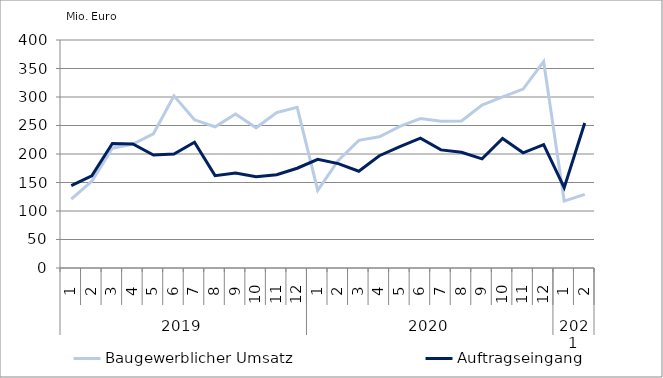
| Category | Baugewerblicher Umsatz | Auftragseingang |
|---|---|---|
| 0 | 120975.133 | 144510.881 |
| 1 | 152329.786 | 161685.201 |
| 2 | 210227.67 | 218455.879 |
| 3 | 217522.321 | 217610.064 |
| 4 | 235490.429 | 198110.439 |
| 5 | 301963.302 | 200012.086 |
| 6 | 259975.317 | 220559.061 |
| 7 | 247779.658 | 162059.723 |
| 8 | 270249.609 | 166829.611 |
| 9 | 245966.91 | 160120.773 |
| 10 | 272620.351 | 163589.389 |
| 11 | 281810.121 | 175051.247 |
| 12 | 136135.432 | 190647.086 |
| 13 | 188682.361 | 183141.14 |
| 14 | 224009.315 | 169770.009 |
| 15 | 230172.252 | 196979.845 |
| 16 | 248410.714 | 212955.83 |
| 17 | 262078.128 | 227853.487 |
| 18 | 257360.37 | 207209.188 |
| 19 | 257932.168 | 202976.091 |
| 20 | 285866.269 | 191463.844 |
| 21 | 300164.57 | 227245.467 |
| 22 | 313922.518 | 202060.636 |
| 23 | 362040.738 | 216296.504 |
| 24 | 117421.805 | 141020.655 |
| 25 | 129162.55 | 254416.876 |